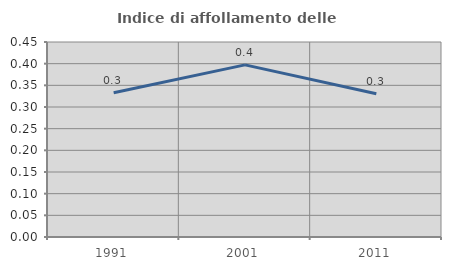
| Category | Indice di affollamento delle abitazioni  |
|---|---|
| 1991.0 | 0.333 |
| 2001.0 | 0.397 |
| 2011.0 | 0.33 |